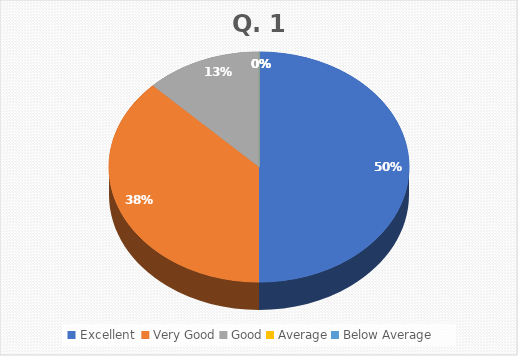
| Category | Series 0 |
|---|---|
| Excellent  | 8 |
| Very Good | 6 |
| Good | 2 |
| Average | 0 |
| Below Average | 0 |